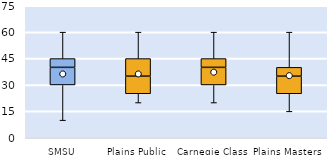
| Category | 25th | 50th | 75th |
|---|---|---|---|
| SMSU | 30 | 10 | 5 |
| Plains Public | 25 | 10 | 10 |
| Carnegie Class | 30 | 10 | 5 |
| Plains Masters | 25 | 10 | 5 |